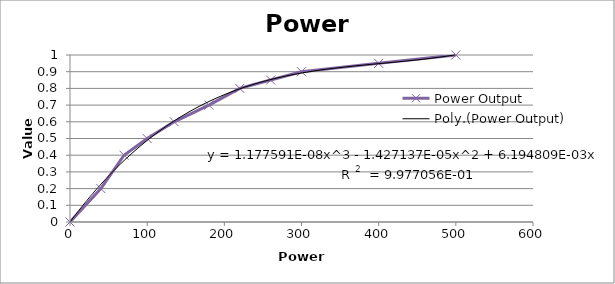
| Category | Power Output |
|---|---|
| 0.0 | 0 |
| 40.0 | 0.2 |
| 70.0 | 0.4 |
| 100.0 | 0.5 |
| 135.0 | 0.6 |
| 180.0 | 0.7 |
| 220.0 | 0.8 |
| 260.0 | 0.85 |
| 300.0 | 0.9 |
| 400.0 | 0.95 |
| 500.0 | 1 |